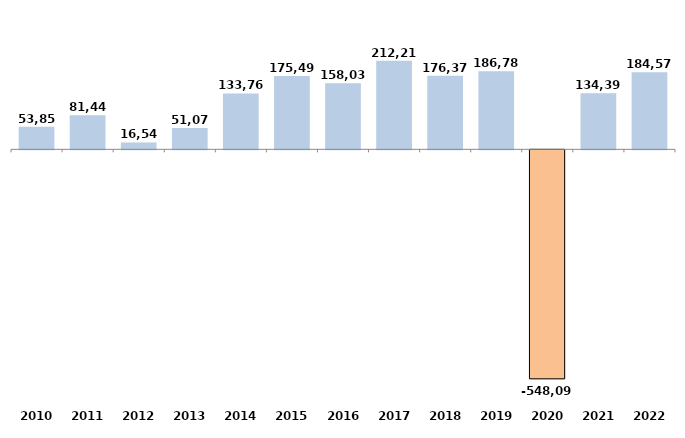
| Category | Series 0 |
|---|---|
| 2010 | 53851.71 |
| 2011 | 81446.57 |
| 2012 | 16548.79 |
| 2013 | 51077.47 |
| 2014 | 133764.72 |
| 2015 | 175495.4 |
| 2016 | 158037.61 |
| 2017 | 212215.67 |
| 2018 | 176373.25 |
| 2019 | 186785.42 |
| 2020 | -548093 |
| 2021 | 134396 |
| 2022 | 184576.62 |